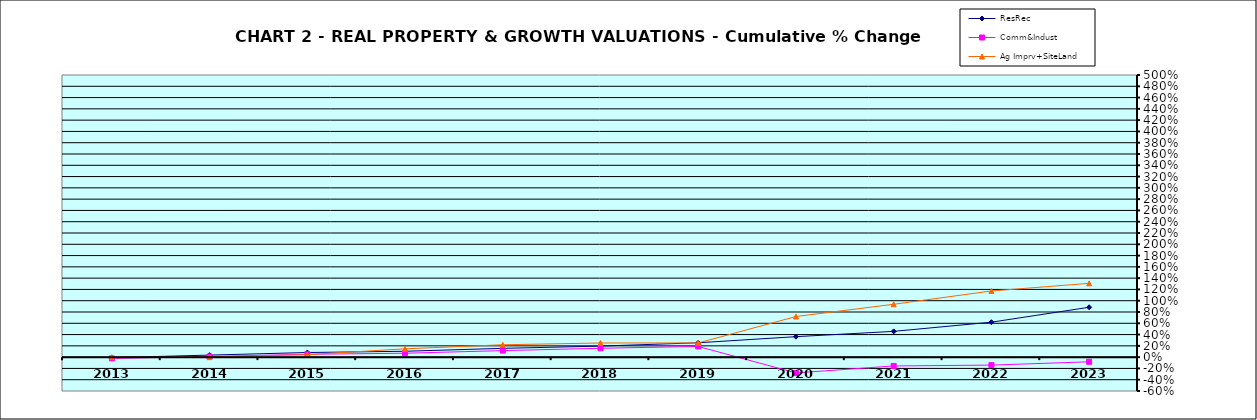
| Category | ResRec | Comm&Indust | Ag Imprv+SiteLand |
|---|---|---|---|
| 2013.0 | -0.009 | -0.022 | 0 |
| 2014.0 | 0.036 | 0.011 | 0 |
| 2015.0 | 0.082 | 0.051 | 0.044 |
| 2016.0 | 0.104 | 0.069 | 0.148 |
| 2017.0 | 0.156 | 0.116 | 0.219 |
| 2018.0 | 0.196 | 0.157 | 0.251 |
| 2019.0 | 0.255 | 0.19 | 0.252 |
| 2020.0 | 0.363 | -0.28 | 0.72 |
| 2021.0 | 0.457 | -0.156 | 0.937 |
| 2022.0 | 0.619 | -0.141 | 1.173 |
| 2023.0 | 0.884 | -0.083 | 1.308 |